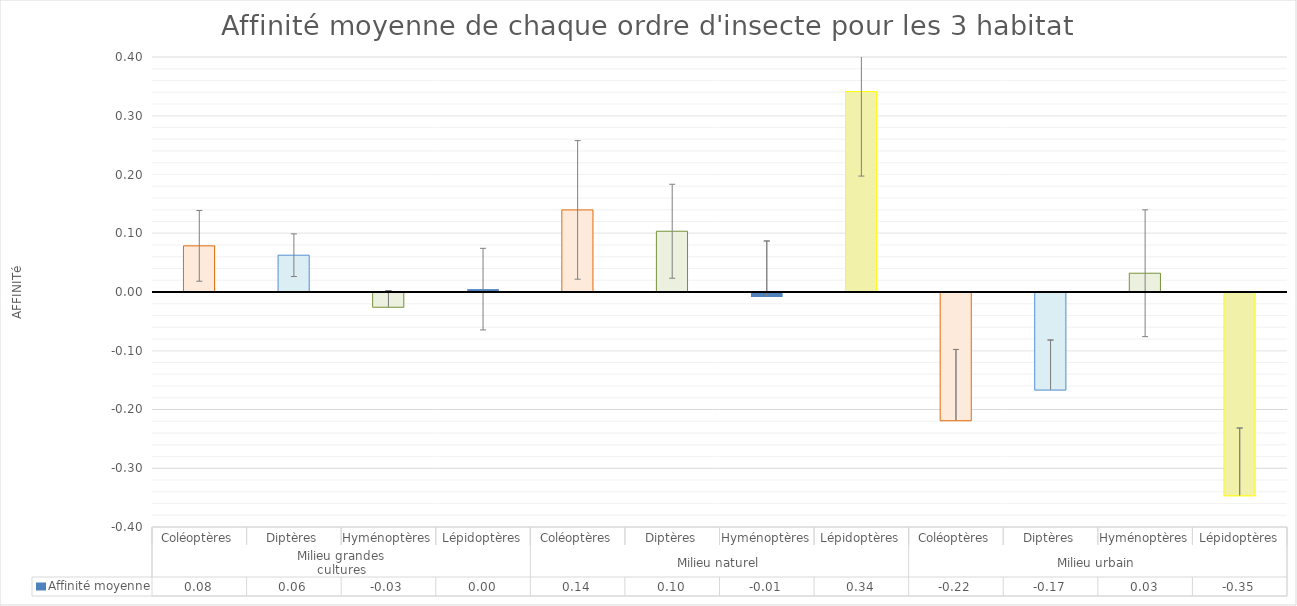
| Category | Affinité moyenne |
|---|---|
| 0 | 0.079 |
| 1 | 0.063 |
| 2 | -0.025 |
| 3 | 0.005 |
| 4 | 0.14 |
| 5 | 0.103 |
| 6 | -0.007 |
| 7 | 0.341 |
| 8 | -0.218 |
| 9 | -0.166 |
| 10 | 0.032 |
| 11 | -0.346 |